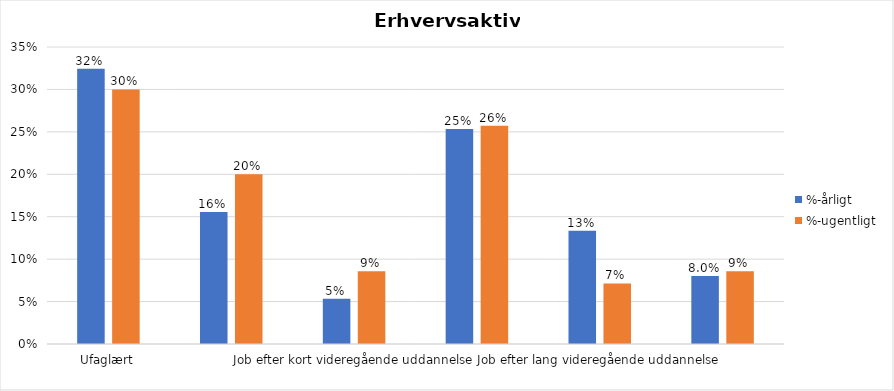
| Category | %-årligt | %-ugentligt |
|---|---|---|
| Ufaglært | 0.324 | 0.3 |
| Erhvervsfagligt job | 0.156 | 0.2 |
| Job efter kort videregående uddannelse | 0.053 | 0.086 |
| Job efter mellemlang videregående uddannelse | 0.253 | 0.257 |
| Job efter lang videregående uddannelse | 0.133 | 0.071 |
| Selvstændig | 0.08 | 0.086 |